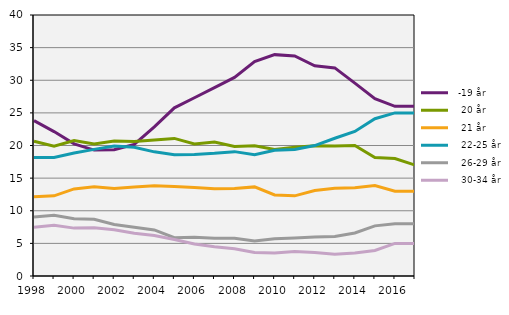
| Category |   -19 år |    20 år |    21 år |    22-25 år |    26-29 år |    30-34 år |
|---|---|---|---|---|---|---|
| 1998.0 | 23.802 | 20.654 | 12.158 | 18.154 | 9.059 | 7.464 |
| 1999.0 | 22.136 | 19.881 | 12.28 | 18.174 | 9.297 | 7.769 |
| 2000.0 | 20.256 | 20.766 | 13.348 | 18.844 | 8.775 | 7.338 |
| 2001.0 | 19.293 | 20.224 | 13.669 | 19.404 | 8.696 | 7.393 |
| 2002.0 | 19.34 | 20.678 | 13.411 | 19.911 | 7.898 | 7.092 |
| 2003.0 | 20.175 | 20.608 | 13.653 | 19.728 | 7.471 | 6.54 |
| 2004.0 | 22.865 | 20.84 | 13.847 | 19.026 | 7.059 | 6.21 |
| 2005.0 | 25.779 | 21.085 | 13.703 | 18.585 | 5.865 | 5.581 |
| 2006.0 | 27.318 | 20.228 | 13.56 | 18.632 | 5.95 | 4.914 |
| 2007.0 | 28.872 | 20.544 | 13.378 | 18.798 | 5.79 | 4.479 |
| 2008.0 | 30.43 | 19.855 | 13.422 | 19.059 | 5.797 | 4.186 |
| 2009.0 | 32.853 | 19.952 | 13.657 | 18.581 | 5.35 | 3.592 |
| 2010.0 | 33.926 | 19.383 | 12.412 | 19.279 | 5.702 | 3.532 |
| 2011.0 | 33.721 | 19.742 | 12.282 | 19.381 | 5.829 | 3.746 |
| 2012.0 | 32.225 | 19.966 | 13.094 | 19.987 | 5.976 | 3.604 |
| 2013.0 | 31.89 | 19.905 | 13.45 | 21.109 | 6.053 | 3.323 |
| 2014.0 | 29.554 | 20.008 | 13.538 | 22.161 | 6.602 | 3.528 |
| 2015.0 | 27.189 | 18.147 | 13.871 | 24.107 | 7.682 | 3.918 |
| 2016.0 | 26 | 18 | 13 | 25 | 8 | 5 |
| 2017.0 | 26 | 17 | 13 | 25 | 8 | 5 |